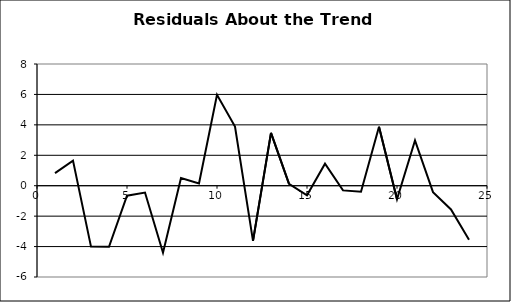
| Category | Series 1 |
|---|---|
| 0 | 0.826 |
| 1 | 1.653 |
| 2 | -4.001 |
| 3 | -4.016 |
| 4 | -0.653 |
| 5 | -0.451 |
| 6 | -4.404 |
| 7 | 0.508 |
| 8 | 0.146 |
| 9 | 5.981 |
| 10 | 3.89 |
| 11 | -3.622 |
| 12 | 3.47 |
| 13 | 0.123 |
| 14 | -0.626 |
| 15 | 1.443 |
| 16 | -0.307 |
| 17 | -0.398 |
| 18 | 3.882 |
| 19 | -0.885 |
| 20 | 2.978 |
| 21 | -0.425 |
| 22 | -1.56 |
| 23 | -3.553 |